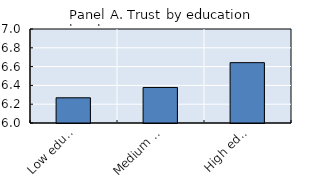
| Category | Self-reported trust in others |
|---|---|
| Low education (high school or less) | 6.268 |
| Medium education (some diploma, college or non-tertiary degree) | 6.378 |
| High education (undergraduate or post-graduate degree) | 6.642 |